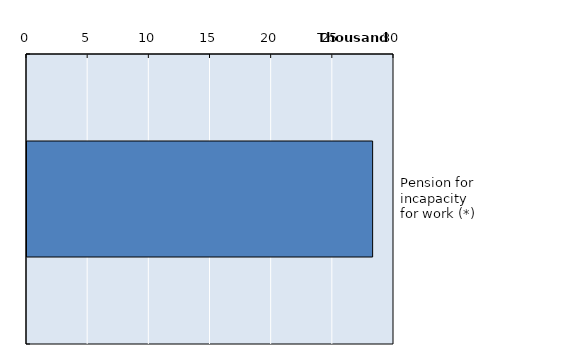
| Category | Series 0 |
|---|---|
| Pension for incapacity for work (*) | 28253 |